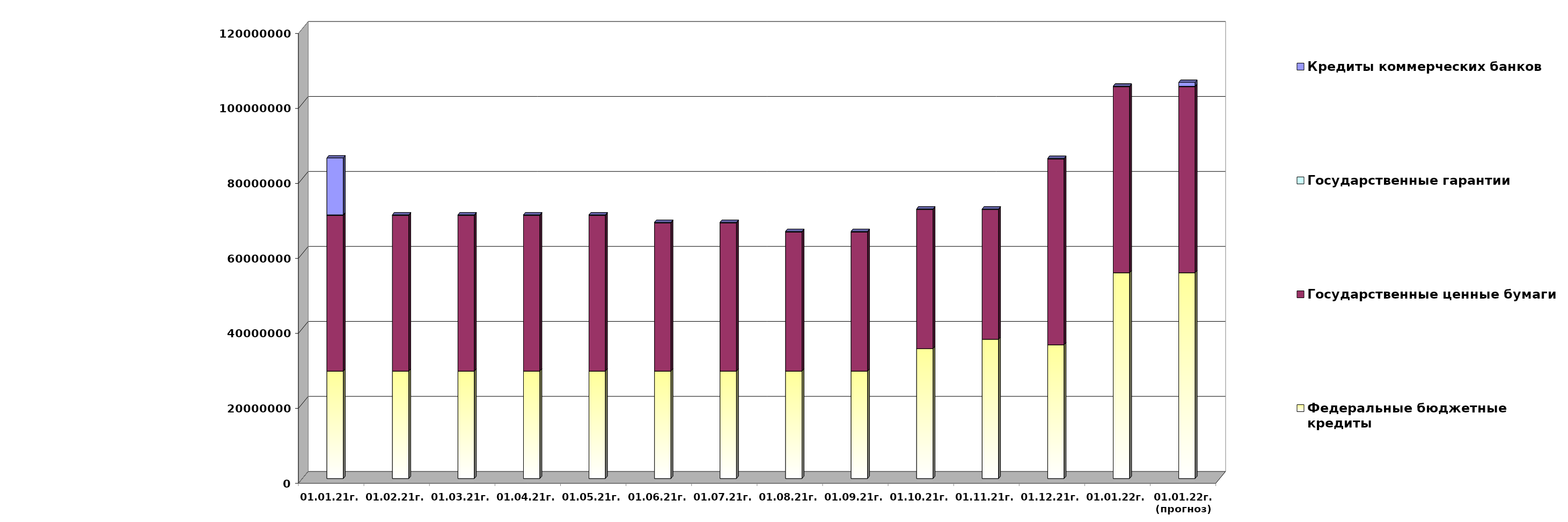
| Category | Федеральные бюджетные кредиты | Государственные ценные бумаги  | Государственные гарантии | Кредиты коммерческих банков |
|---|---|---|---|---|
| 01.01.21г. | 28654967.463 | 41500000 | 184738.25 | 15190000 |
| 01.02.21г. | 28654967.463 | 41500000 | 182966.25 | 0 |
| 01.03.21г. | 28654967.463 | 41500000 | 182966.25 | 0 |
| 01.04.21г. | 28654967.463 | 41500000 | 182966.25 | 0 |
| 01.05.21г. | 28654967.463 | 41500000 | 174735.46 | 0 |
| 01.06.21г. | 28654967.463 | 39500000 | 174735.46 | 0 |
| 01.07.21г. | 28654967.463 | 39500000 | 174735.46 | 0 |
| 01.08.21г. | 28654967.463 | 37100000 | 158212.22 | 0 |
| 01.09.21г. | 28654967.463 | 37100000 | 158212.22 | 0 |
| 01.10.21г. | 34649676.663 | 37100000 | 158212.22 | 0 |
| 01.11.21г. | 37149676.663 | 34600000 | 141570.67 | 0 |
| 01.12.21г. | 35662617.913 | 49600000 | 141570.67 | 0 |
| 01.01.22г. | 54900618.713 | 49600000 | 141570.67 | 0 |
| 01.01.22г.
(прогноз) | 54900618.7 | 49600000 | 141570.7 | 1029418.4 |